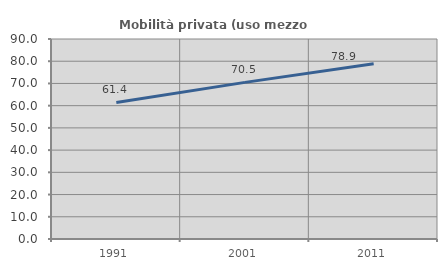
| Category | Mobilità privata (uso mezzo privato) |
|---|---|
| 1991.0 | 61.437 |
| 2001.0 | 70.482 |
| 2011.0 | 78.863 |